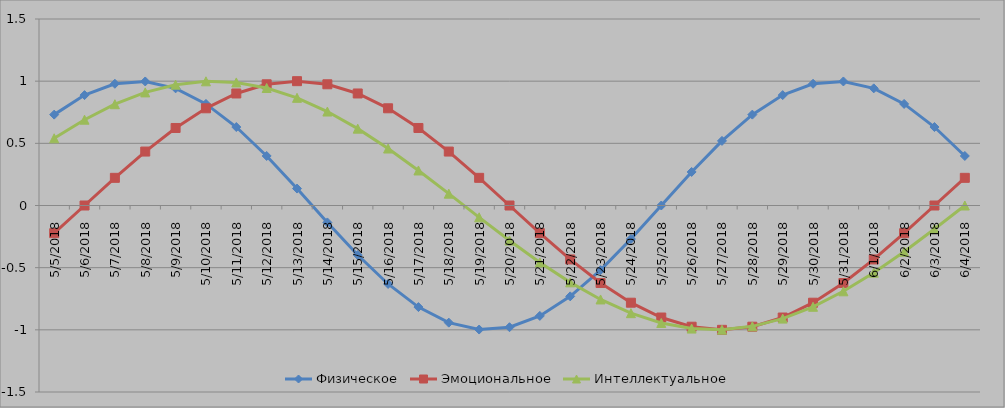
| Category | Физическое | Эмоциональное | Интеллектуальное |
|---|---|---|---|
| 5/5/18 | 0.731 | -0.223 | 0.541 |
| 5/6/18 | 0.888 | 0 | 0.69 |
| 5/7/18 | 0.979 | 0.223 | 0.815 |
| 5/8/18 | 0.998 | 0.434 | 0.91 |
| 5/9/18 | 0.942 | 0.623 | 0.972 |
| 5/10/18 | 0.817 | 0.782 | 0.999 |
| 5/11/18 | 0.631 | 0.901 | 0.99 |
| 5/12/18 | 0.398 | 0.975 | 0.945 |
| 5/13/18 | 0.136 | 1 | 0.866 |
| 5/14/18 | -0.136 | 0.975 | 0.756 |
| 5/15/18 | -0.398 | 0.901 | 0.618 |
| 5/16/18 | -0.631 | 0.782 | 0.458 |
| 5/17/18 | -0.817 | 0.623 | 0.282 |
| 5/18/18 | -0.942 | 0.434 | 0.095 |
| 5/19/18 | -0.998 | 0.223 | -0.095 |
| 5/20/18 | -0.979 | 0 | -0.282 |
| 5/21/18 | -0.888 | -0.223 | -0.458 |
| 5/22/18 | -0.731 | -0.434 | -0.618 |
| 5/23/18 | -0.52 | -0.623 | -0.756 |
| 5/24/18 | -0.27 | -0.782 | -0.866 |
| 5/25/18 | 0 | -0.901 | -0.945 |
| 5/26/18 | 0.27 | -0.975 | -0.99 |
| 5/27/18 | 0.52 | -1 | -0.999 |
| 5/28/18 | 0.731 | -0.975 | -0.972 |
| 5/29/18 | 0.888 | -0.901 | -0.91 |
| 5/30/18 | 0.979 | -0.782 | -0.815 |
| 5/31/18 | 0.998 | -0.623 | -0.69 |
| 6/1/18 | 0.942 | -0.434 | -0.541 |
| 6/2/18 | 0.817 | -0.223 | -0.372 |
| 6/3/18 | 0.631 | 0 | -0.189 |
| 6/4/18 | 0.398 | 0.223 | 0 |